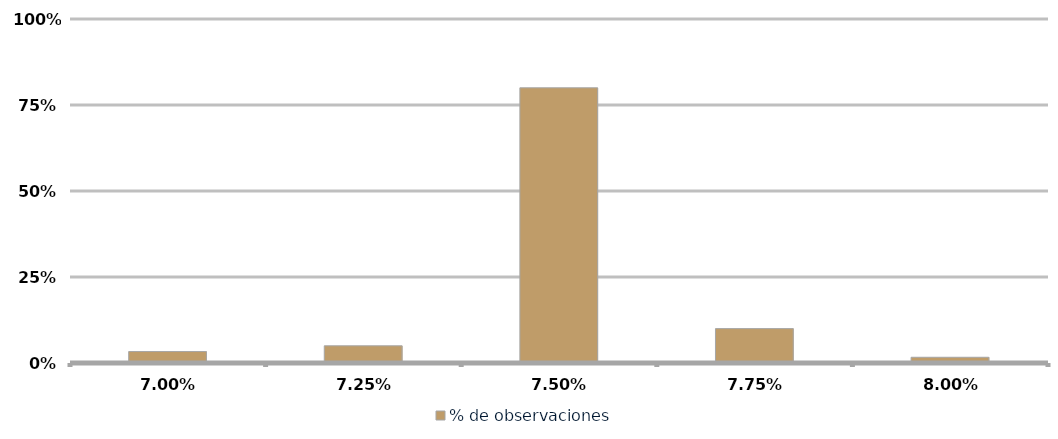
| Category | % de observaciones  |
|---|---|
| 0.06999999999999999 | 0.033 |
| 0.0725 | 0.05 |
| 0.075 | 0.8 |
| 0.0775 | 0.1 |
| 0.08 | 0.017 |